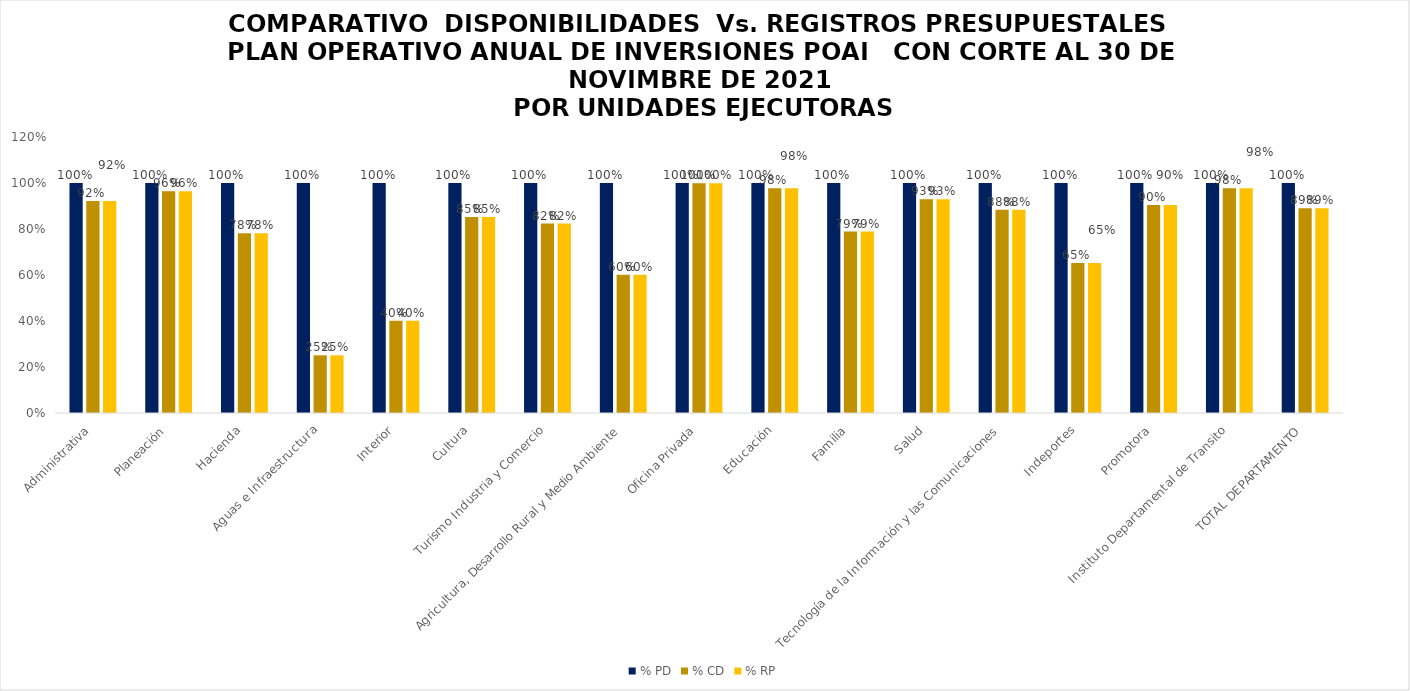
| Category | % PD | % CD | % RP |
|---|---|---|---|
| Administrativa | 1 | 0.921 | 0.921 |
| Planeación | 1 | 0.964 | 0.964 |
| Hacienda | 1 | 0.781 | 0.781 |
| Aguas e Infraestructura | 1 | 0.251 | 0.251 |
| Interior | 1 | 0.401 | 0.401 |
| Cultura | 1 | 0.852 | 0.852 |
| Turismo Industria y Comercio | 1 | 0.824 | 0.824 |
| Agricultura, Desarrollo Rural y Medio Ambiente | 1 | 0.602 | 0.602 |
| Oficina Privada | 1 | 0.999 | 0.999 |
| Educación | 1 | 0.977 | 0.977 |
| Familia | 1 | 0.789 | 0.789 |
| Salud | 1 | 0.929 | 0.929 |
| Tecnología de la Información y las Comunicaciones | 1 | 0.884 | 0.884 |
| Indeportes | 1 | 0.653 | 0.653 |
| Promotora | 1 | 0.904 | 0.904 |
| Instituto Departamental de Transito | 1 | 0.977 | 0.977 |
| TOTAL DEPARTAMENTO | 1 | 0.89 | 0.89 |